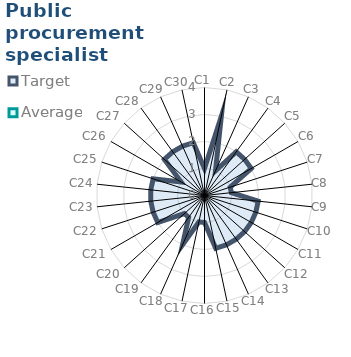
| Category | Target | Average |
|---|---|---|
| C1 | 1 | 0 |
| C2 | 3 | 0 |
| C3 | 1 | 0 |
| C4 | 2 | 0 |
| C5 | 2 | 0 |
| C6 | 2 | 0 |
| C7 | 1 | 0 |
| C8 | 1 | 0 |
| C9 | 2 | 0 |
| C10 | 2 | 0 |
| C11 | 2 | 0 |
| C12 | 2 | 0 |
| C13 | 2 | 0 |
| C14 | 2 | 0 |
| C15 | 2 | 0 |
| C16 | 1 | 0 |
| C17 | 1 | 0 |
| C18 | 2 | 0 |
| C19 | 1 | 0 |
| C20 | 1 | 0 |
| C21 | 2 | 0 |
| C22 | 2 | 0 |
| C23 | 2 | 0 |
| C24 | 2 | 0 |
| C25 | 2 | 0 |
| C26 | 1 | 0 |
| C27 | 2 | 0 |
| C28 | 2 | 0 |
| C29 | 2 | 0 |
| C30 | 2 | 0 |